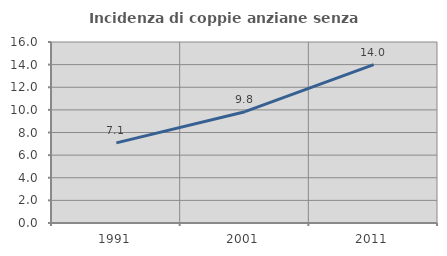
| Category | Incidenza di coppie anziane senza figli  |
|---|---|
| 1991.0 | 7.082 |
| 2001.0 | 9.842 |
| 2011.0 | 13.994 |